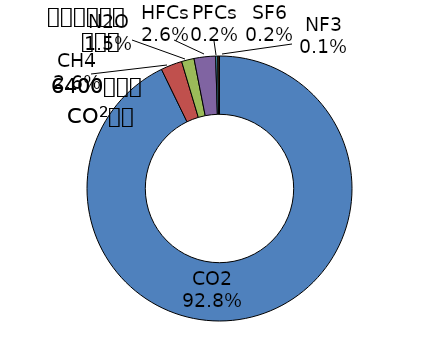
| Category | Series 0 |
|---|---|
| CO2 | 0.928 |
| CH4 | 0.026 |
| N2O | 0.015 |
| HFCs | 0.026 |
| PFCs | 0.002 |
| SF6 | 0.002 |
| NF3 | 0.001 |